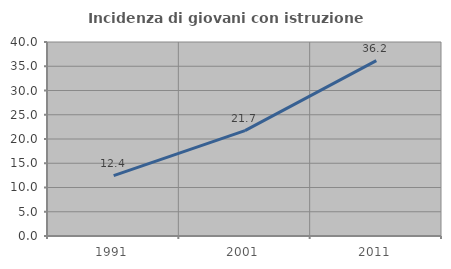
| Category | Incidenza di giovani con istruzione universitaria |
|---|---|
| 1991.0 | 12.445 |
| 2001.0 | 21.726 |
| 2011.0 | 36.168 |